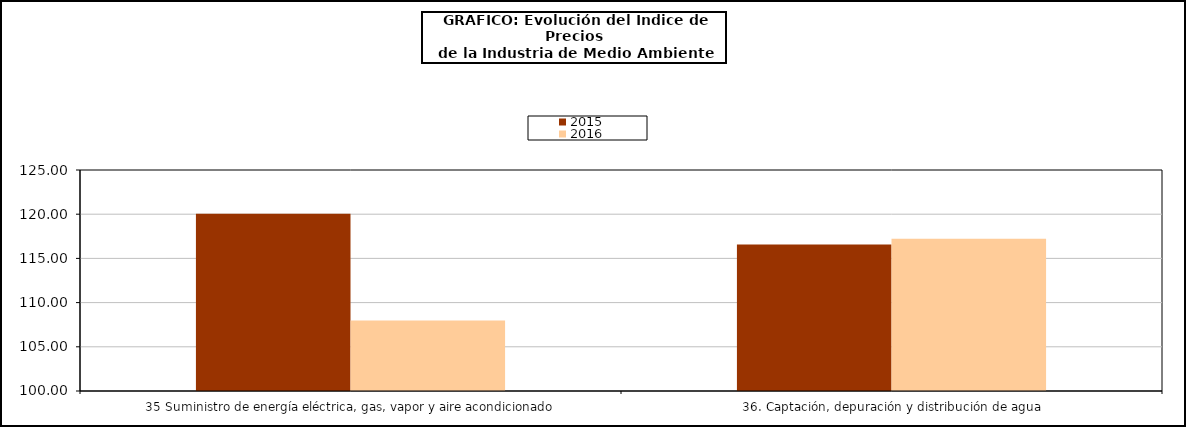
| Category | 2015 | 2016 |
|---|---|---|
| 35 Suministro de energía eléctrica, gas, vapor y aire acondicionado | 120.064 | 107.964 |
| 36. Captación, depuración y distribución de agua | 116.564 | 117.214 |